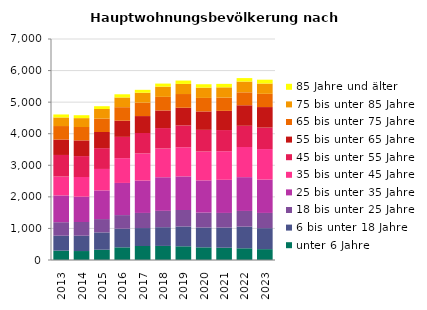
| Category | unter 6 Jahre | 6 bis unter 18 Jahre | 18 bis unter 25 Jahre | 25 bis unter 35 Jahre | 35 bis unter 45 Jahre | 45 bis unter 55 Jahre | 55 bis unter 65 Jahre | 65 bis unter 75 Jahre | 75 bis unter 85 Jahre | 85 Jahre und älter |
|---|---|---|---|---|---|---|---|---|---|---|
| 2013.0 | 296 | 473 | 428 | 848 | 599 | 683 | 488 | 428 | 272 | 95 |
| 2014.0 | 284 | 485 | 434 | 803 | 623 | 662 | 497 | 425 | 281 | 92 |
| 2015.0 | 326 | 548 | 422 | 908 | 680 | 659 | 512 | 422 | 305 | 89 |
| 2016.0 | 401 | 590 | 431 | 1019 | 785 | 674 | 512 | 428 | 308 | 101 |
| 2017.0 | 443 | 569 | 479 | 1025 | 860 | 647 | 536 | 425 | 314 | 92 |
| 2018.0 | 446 | 593 | 518 | 1064 | 911 | 647 | 557 | 431 | 323 | 98 |
| 2019.0 | 434 | 629 | 521 | 1064 | 923 | 692 | 560 | 434 | 320 | 107 |
| 2020.0 | 401 | 629 | 470 | 1022 | 914 | 686 | 584 | 428 | 326 | 107 |
| 2021.0 | 389 | 638 | 464 | 1049 | 905 | 671 | 608 | 419 | 326 | 110 |
| 2022.0 | 371 | 686 | 497 | 1070 | 956 | 671 | 650 | 410 | 341 | 110 |
| 2023.0 | 344 | 665 | 482 | 1055 | 968 | 680 | 650 | 419 | 326 | 122 |